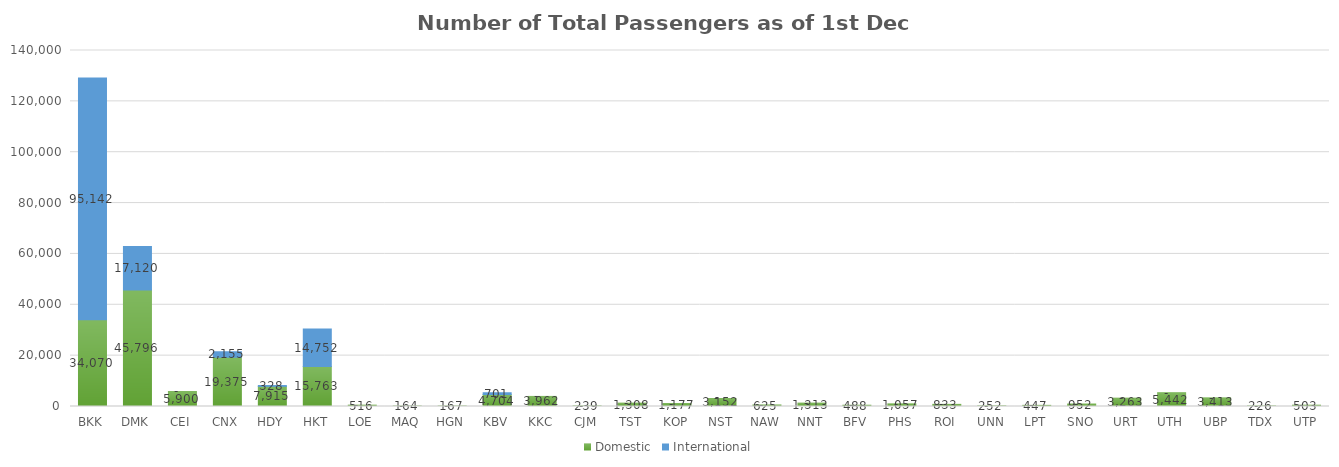
| Category | Domestic | International |
|---|---|---|
| BKK | 34070 | 95142 |
| DMK | 45796 | 17120 |
| CEI | 5900 | 0 |
| CNX | 19375 | 2155 |
| HDY | 7915 | 328 |
| HKT | 15763 | 14752 |
| LOE | 516 | 0 |
| MAQ | 164 | 0 |
| HGN | 167 | 0 |
| KBV | 4704 | 701 |
| KKC | 3962 | 0 |
| CJM | 239 | 0 |
| TST | 1308 | 0 |
| KOP | 1177 | 0 |
| NST | 3152 | 0 |
| NAW | 625 | 0 |
| NNT | 1313 | 0 |
| BFV | 488 | 0 |
| PHS | 1057 | 0 |
| ROI | 833 | 0 |
| UNN | 252 | 0 |
| LPT | 447 | 0 |
| SNO | 952 | 0 |
| URT | 3263 | 0 |
| UTH | 5442 | 0 |
| UBP | 3413 | 0 |
| TDX | 226 | 0 |
| UTP | 503 | 0 |